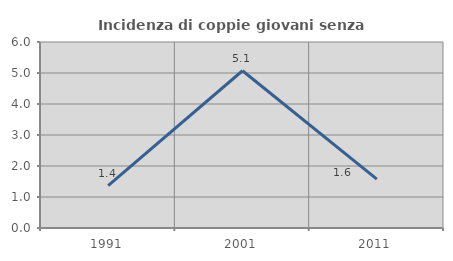
| Category | Incidenza di coppie giovani senza figli |
|---|---|
| 1991.0 | 1.37 |
| 2001.0 | 5.072 |
| 2011.0 | 1.575 |